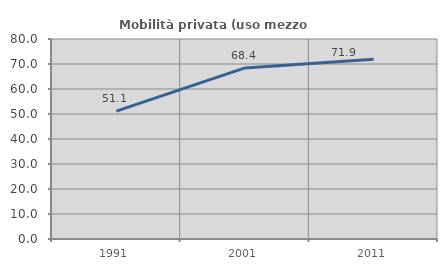
| Category | Mobilità privata (uso mezzo privato) |
|---|---|
| 1991.0 | 51.12 |
| 2001.0 | 68.424 |
| 2011.0 | 71.946 |